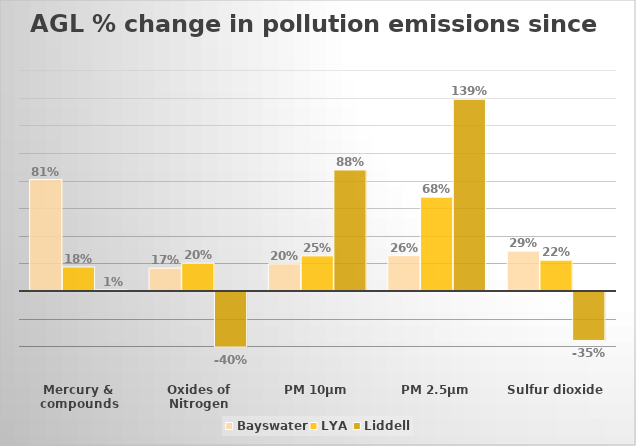
| Category |  Bayswater  |  LYA  |  Liddell  |
|---|---|---|---|
| Mercury & compounds | 0.807 | 0.175 | 0.009 |
| Oxides of Nitrogen | 0.166 | 0.202 | -0.401 |
| PM 10μm | 0.197 | 0.255 | 0.877 |
| PM 2.5μm | 0.256 | 0.68 | 1.388 |
| Sulfur dioxide | 0.289 | 0.224 | -0.354 |